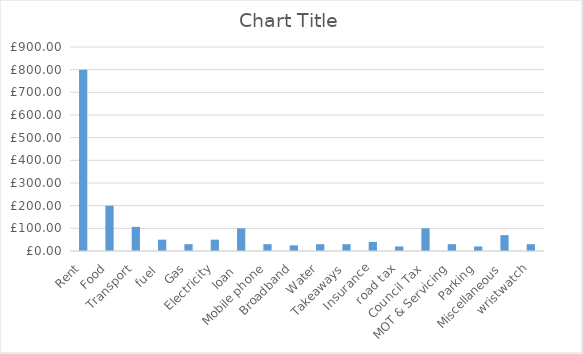
| Category | Series 0 |
|---|---|
| Rent | 800 |
| Food | 200 |
| Transport | 106.4 |
| fuel  | 50 |
| Gas | 30 |
| Electricity | 50 |
| loan  | 100 |
| Mobile phone | 30 |
| Broadband | 25 |
| Water | 30 |
| Takeaways | 30 |
| Insurance | 40 |
| road tax | 20 |
| Council Tax | 100 |
| MOT & Servicing | 30 |
| Parking | 20 |
| Miscellaneous | 70 |
| wristwatch | 30 |